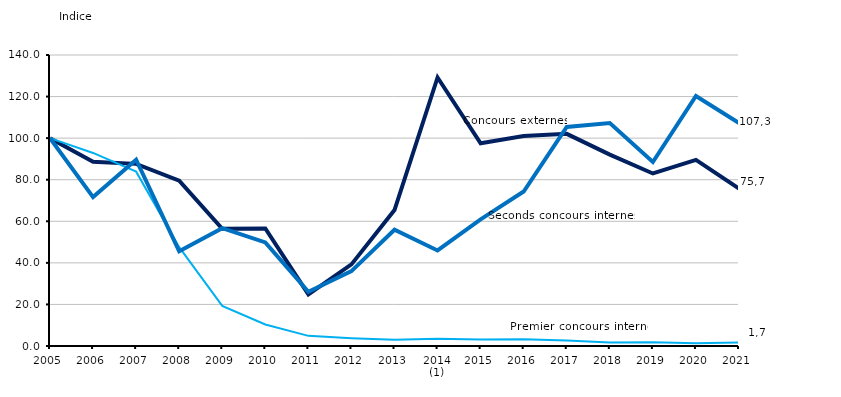
| Category | Concours externes  | Premier concours interne | Seconds concours internes |
|---|---|---|---|
| 2005 | 100 | 100 | 100 |
| 2006 | 88.613 | 92.877 | 71.648 |
| 2007 | 87.624 | 83.879 | 89.655 |
| 2008 | 79.501 | 47.546 | 45.594 |
| 2009 | 56.405 | 19.291 | 56.705 |
| 2010 | 56.526 | 10.327 | 49.808 |
| 2011 | 24.817 | 4.874 | 26.054 |
| 2012 | 39.268 | 3.783 | 36.015 |
| 2013 | 65.396 | 2.965 | 55.939 |
| 2014 (1) | 129.176 | 3.545 | 45.977 |
| 2015 | 97.523 | 3.067 | 60.92 |
| 2016 | 101.07 | 3.306 | 74.33 |
| 2017 | 102.059 | 2.59 | 105.364 |
| 2018 | 92.095 | 1.704 | 107.28 |
| 2019 | 83 | 1.772 | 88.506 |
| 2020 | 89.53 | 1.329 | 120.307 |
| 2021 | 75.722 | 1.67 | 107.28 |